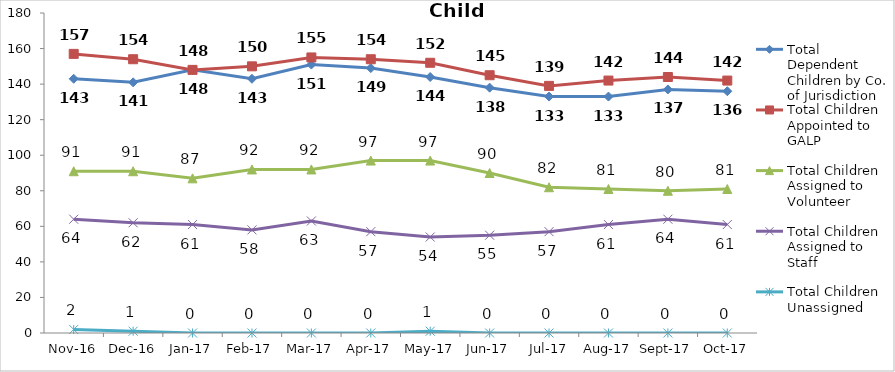
| Category | Total Dependent Children by Co. of Jurisdiction | Total Children Appointed to GALP | Total Children Assigned to Volunteer | Total Children Assigned to Staff | Total Children Unassigned |
|---|---|---|---|---|---|
| 2016-11-01 | 143 | 157 | 91 | 64 | 2 |
| 2016-12-01 | 141 | 154 | 91 | 62 | 1 |
| 2017-01-01 | 148 | 148 | 87 | 61 | 0 |
| 2017-02-01 | 143 | 150 | 92 | 58 | 0 |
| 2017-03-01 | 151 | 155 | 92 | 63 | 0 |
| 2017-04-01 | 149 | 154 | 97 | 57 | 0 |
| 2017-05-01 | 144 | 152 | 97 | 54 | 1 |
| 2017-06-01 | 138 | 145 | 90 | 55 | 0 |
| 2017-07-01 | 133 | 139 | 82 | 57 | 0 |
| 2017-08-01 | 133 | 142 | 81 | 61 | 0 |
| 2017-09-01 | 137 | 144 | 80 | 64 | 0 |
| 2017-10-01 | 136 | 142 | 81 | 61 | 0 |